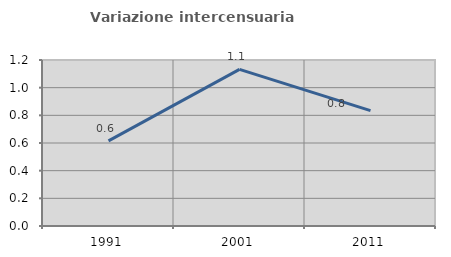
| Category | Variazione intercensuaria annua |
|---|---|
| 1991.0 | 0.615 |
| 2001.0 | 1.132 |
| 2011.0 | 0.834 |